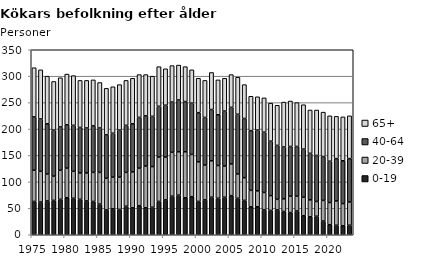
| Category | 0-19 | 20-39 | 40-64 | 65+ |
|---|---|---|---|---|
| 1975.0 | 63 | 59 | 101 | 93 |
| 1976.0 | 62 | 58 | 99 | 93 |
| 1977.0 | 64 | 51 | 95 | 90 |
| 1978.0 | 65 | 46 | 87 | 92 |
| 1979.0 | 67 | 55 | 82 | 93 |
| 1980.0 | 70 | 56 | 82 | 96 |
| 1981.0 | 69 | 51 | 87 | 94 |
| 1982.0 | 67 | 50 | 86 | 89 |
| 1983.0 | 64 | 53 | 85 | 90 |
| 1984.0 | 63 | 55 | 88 | 87 |
| 1985.0 | 58 | 60 | 84 | 86 |
| 1986.0 | 47 | 60 | 82 | 88 |
| 1987.0 | 49 | 60 | 83 | 88 |
| 1988.0 | 48 | 61 | 89 | 86 |
| 1989.0 | 54 | 64 | 89 | 85 |
| 1990.0 | 51 | 68 | 91 | 86 |
| 1991.0 | 55 | 71 | 96 | 81 |
| 1992.0 | 51 | 79 | 95 | 78 |
| 1993.0 | 52 | 77 | 95 | 76 |
| 1994.0 | 63 | 84 | 96 | 75 |
| 1995.0 | 66 | 81 | 98 | 69 |
| 1996.0 | 73 | 83 | 95 | 69 |
| 1997.0 | 75 | 82 | 98 | 66 |
| 1998.0 | 70 | 87 | 95 | 66 |
| 1999.0 | 72 | 80 | 97 | 63 |
| 2000.0 | 63 | 75 | 93 | 65 |
| 2001.0 | 66 | 66 | 90 | 70 |
| 2002.0 | 71 | 69 | 97 | 70 |
| 2003.0 | 69 | 62 | 96 | 66 |
| 2004.0 | 71 | 59 | 104 | 62 |
| 2005.0 | 74 | 60 | 107 | 62 |
| 2006.0 | 69 | 46 | 113 | 70 |
| 2007.0 | 65 | 43 | 112 | 64 |
| 2008.0 | 53 | 31 | 113 | 65 |
| 2009.0 | 53 | 30 | 115 | 63 |
| 2010.0 | 47 | 33 | 114 | 65 |
| 2011.0 | 46 | 28 | 103 | 72 |
| 2012.0 | 47 | 20 | 102 | 76 |
| 2013.0 | 44 | 24 | 98 | 85 |
| 2014.0 | 42 | 31 | 94 | 86 |
| 2015.0 | 45 | 28 | 94 | 83 |
| 2016.0 | 36 | 35 | 91 | 84 |
| 2017.0 | 34 | 32 | 88 | 82 |
| 2018.0 | 35 | 28 | 87 | 86 |
| 2019.0 | 26 | 39 | 83 | 84 |
| 2020.0 | 19 | 42 | 78 | 86 |
| 2021.0 | 18 | 46 | 80 | 80 |
| 2022.0 | 17 | 42 | 81 | 83 |
| 2023.0 | 18 | 44 | 82 | 81 |